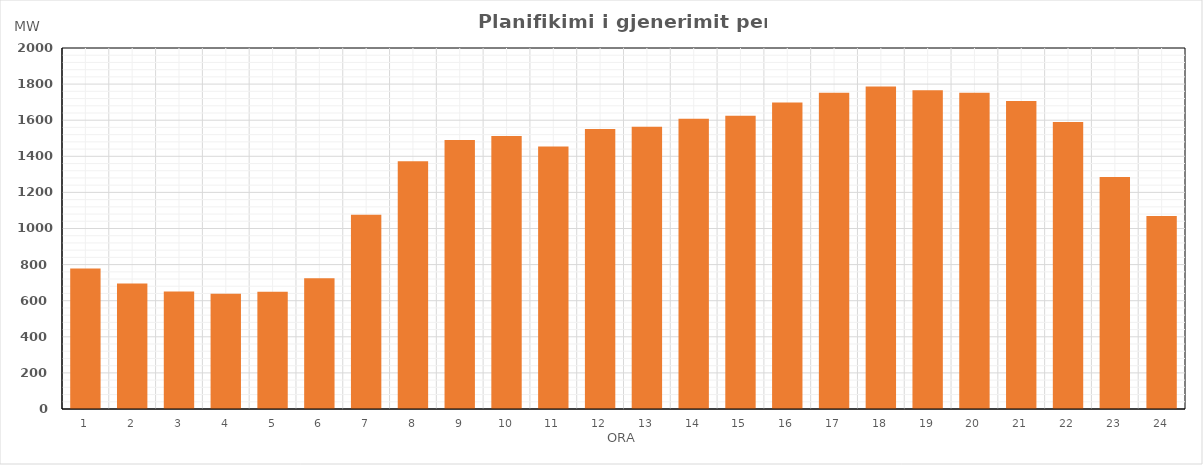
| Category | Max (MW) |
|---|---|
| 0 | 778.54 |
| 1 | 694.84 |
| 2 | 650.75 |
| 3 | 638.35 |
| 4 | 650.06 |
| 5 | 724.45 |
| 6 | 1076.48 |
| 7 | 1372.67 |
| 8 | 1490.87 |
| 9 | 1512.79 |
| 10 | 1454.79 |
| 11 | 1551.75 |
| 12 | 1564.19 |
| 13 | 1607.59 |
| 14 | 1624.47 |
| 15 | 1698.38 |
| 16 | 1751.52 |
| 17 | 1786.52 |
| 18 | 1766.45 |
| 19 | 1751.66 |
| 20 | 1705.97 |
| 21 | 1589.58 |
| 22 | 1285.06 |
| 23 | 1069.07 |